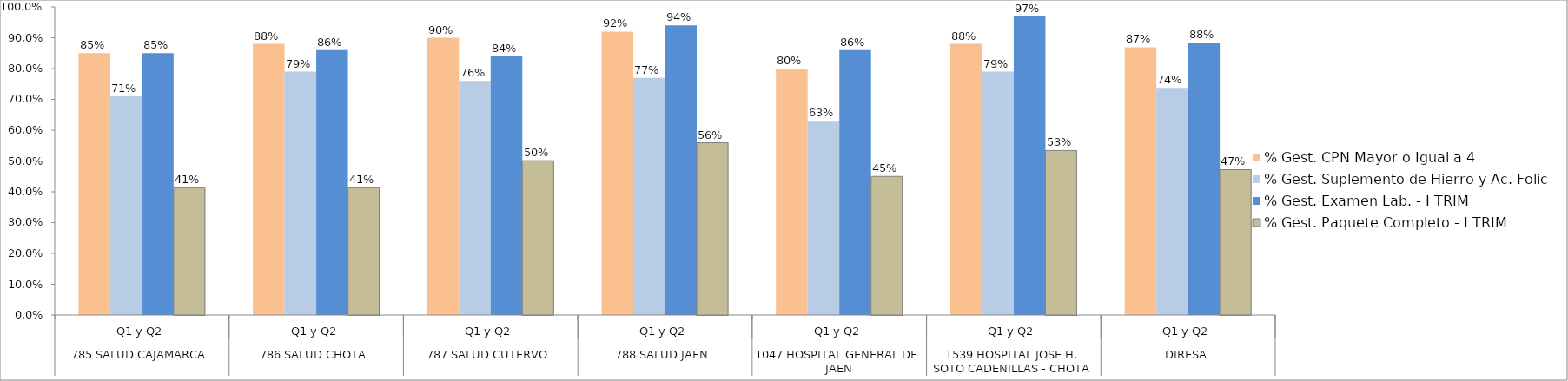
| Category | % Gest. CPN Mayor o Igual a 4 | % Gest. Suplemento de Hierro y Ac. Folic | % Gest. Examen Lab. - I TRIM | % Gest. Paquete Completo - I TRIM |
|---|---|---|---|---|
| 0 | 0.85 | 0.71 | 0.85 | 0.413 |
| 1 | 0.88 | 0.79 | 0.86 | 0.413 |
| 2 | 0.9 | 0.76 | 0.84 | 0.501 |
| 3 | 0.92 | 0.77 | 0.94 | 0.559 |
| 4 | 0.8 | 0.63 | 0.86 | 0.45 |
| 5 | 0.88 | 0.79 | 0.97 | 0.534 |
| 6 | 0.869 | 0.737 | 0.884 | 0.472 |